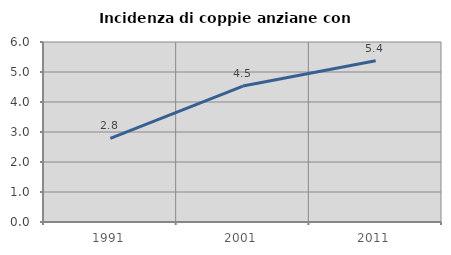
| Category | Incidenza di coppie anziane con figli |
|---|---|
| 1991.0 | 2.786 |
| 2001.0 | 4.533 |
| 2011.0 | 5.376 |